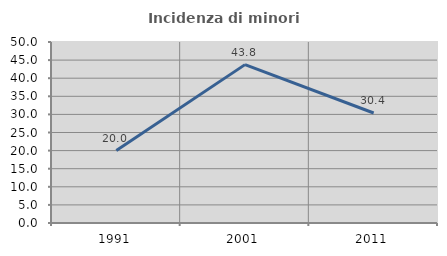
| Category | Incidenza di minori stranieri |
|---|---|
| 1991.0 | 20 |
| 2001.0 | 43.75 |
| 2011.0 | 30.392 |